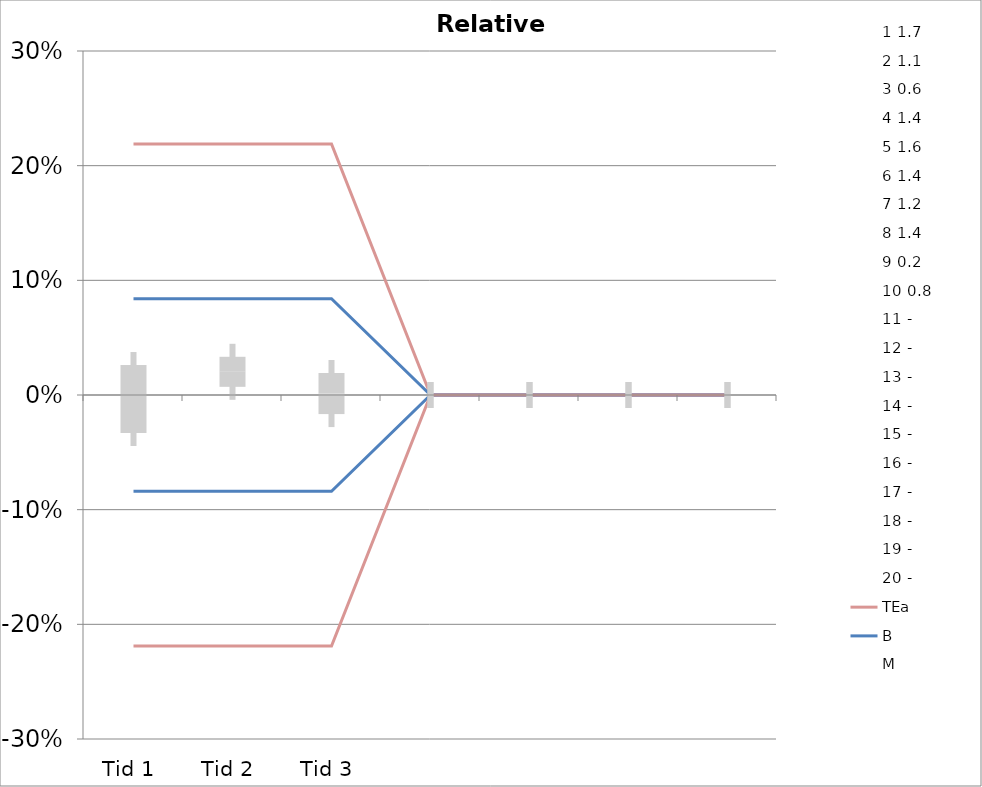
| Category | 1 | 2 | 3 | 4 | 5 | 6 | 7 | 8 | 9 | 10 | 11 | 12 | 13 | 14 | 15 | 16 | 17 | 18 | 19 | 20 | TEa | B | -B | -TEa | M |
|---|---|---|---|---|---|---|---|---|---|---|---|---|---|---|---|---|---|---|---|---|---|---|---|---|---|
| Tid 1 | 0.006 | 0 | 0.091 | -0.043 | -0.026 | 0.022 | 0 | 0.007 | -0.043 | -0.048 | 0 | 0 | 0 | 0 | 0 | 0 | 0 | 0 | 0 | 0 | 0.219 | 0.084 | -0.084 | -0.219 | -0.003 |
| Tid 2 | 0.018 | 0 | 0.036 | 0 | 0.039 | 0.051 | 0.032 | 0.014 | 0 | 0.012 | 0 | 0 | 0 | 0 | 0 | 0 | 0 | 0 | 0 | 0 | 0.219 | 0.084 | -0.084 | -0.219 | 0.02 |
| Tid 3 | -0.024 | 0 | 0.055 | -0.029 | 0.013 | -0.029 | 0.008 | 0.007 | 0 | 0.012 | 0 | 0 | 0 | 0 | 0 | 0 | 0 | 0 | 0 | 0 | 0.219 | 0.084 | -0.084 | -0.219 | 0.001 |